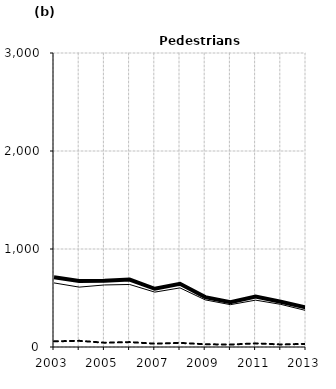
| Category | Built-up | Non built-up | Total |
|---|---|---|---|
| 2003.0 | 654 | 58 | 712 |
| 2004.0 | 611 | 63 | 674 |
| 2005.0 | 633 | 44 | 677 |
| 2006.0 | 638 | 50 | 688 |
| 2007.0 | 560 | 34 | 594 |
| 2008.0 | 603 | 42 | 645 |
| 2009.0 | 481 | 28 | 509 |
| 2010.0 | 432 | 25 | 457 |
| 2011.0 | 478 | 37 | 515 |
| 2012.0 | 435 | 26 | 461 |
| 2013.0 | 372 | 32 | 404 |